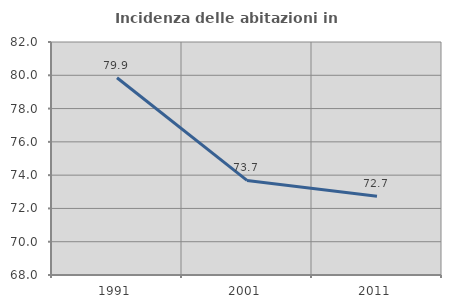
| Category | Incidenza delle abitazioni in proprietà  |
|---|---|
| 1991.0 | 79.853 |
| 2001.0 | 73.684 |
| 2011.0 | 72.727 |